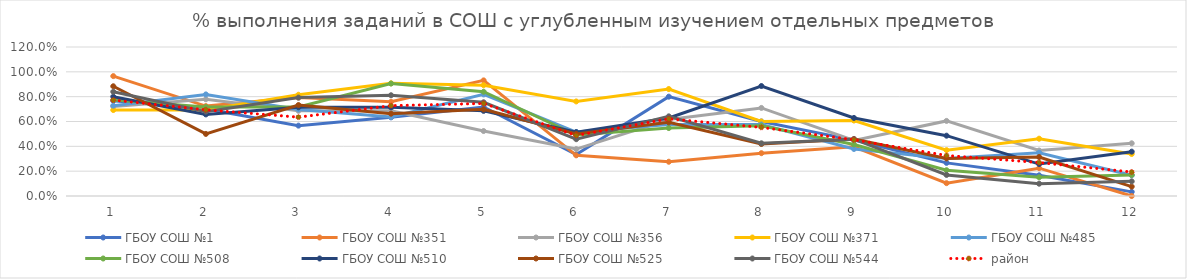
| Category | ГБОУ СОШ №1 | ГБОУ СОШ №351 | ГБОУ СОШ №356 | ГБОУ СОШ №371 | ГБОУ СОШ №485 | ГБОУ СОШ №508 | ГБОУ СОШ №510 | ГБОУ СОШ №525 | ГБОУ СОШ №544 | район |
|---|---|---|---|---|---|---|---|---|---|---|
| 0 | 0.767 | 0.966 | 0.721 | 0.692 | 0.727 | 0.774 | 0.8 | 0.884 | 0.84 | 0.773 |
| 1 | 0.7 | 0.724 | 0.779 | 0.692 | 0.818 | 0.717 | 0.657 | 0.5 | 0.679 | 0.694 |
| 2 | 0.567 | 0.793 | 0.686 | 0.815 | 0.697 | 0.717 | 0.714 | 0.733 | 0.792 | 0.635 |
| 3 | 0.633 | 0.759 | 0.686 | 0.908 | 0.636 | 0.906 | 0.714 | 0.663 | 0.811 | 0.728 |
| 4 | 0.717 | 0.931 | 0.523 | 0.892 | 0.818 | 0.84 | 0.686 | 0.698 | 0.755 | 0.745 |
| 5 | 0.333 | 0.328 | 0.378 | 0.762 | 0.515 | 0.491 | 0.514 | 0.5 | 0.458 | 0.488 |
| 6 | 0.8 | 0.276 | 0.616 | 0.862 | 0.576 | 0.547 | 0.629 | 0.593 | 0.642 | 0.622 |
| 7 | 0.6 | 0.345 | 0.709 | 0.6 | 0.576 | 0.566 | 0.886 | 0.419 | 0.425 | 0.552 |
| 8 | 0.45 | 0.397 | 0.448 | 0.608 | 0.379 | 0.415 | 0.629 | 0.459 | 0.458 | 0.453 |
| 9 | 0.267 | 0.103 | 0.605 | 0.369 | 0.303 | 0.208 | 0.486 | 0.302 | 0.17 | 0.326 |
| 10 | 0.167 | 0.224 | 0.366 | 0.462 | 0.348 | 0.151 | 0.257 | 0.314 | 0.099 | 0.269 |
| 11 | 0.033 | 0 | 0.424 | 0.338 | 0.167 | 0.17 | 0.357 | 0.076 | 0.118 | 0.193 |